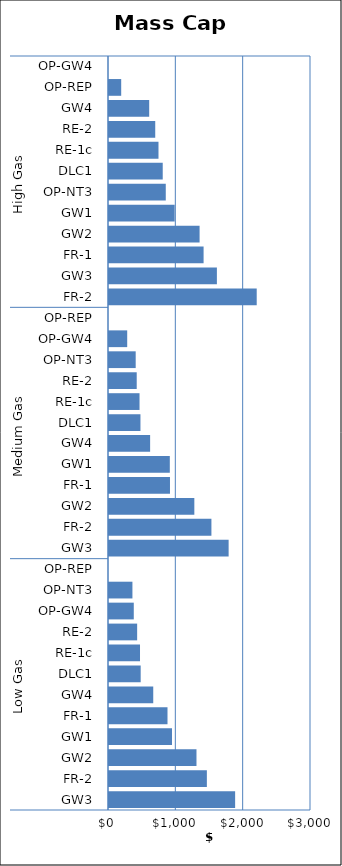
| Category | Mass Cap A |
|---|---|
| 0 | 1873.232 |
| 1 | 1453.521 |
| 2 | 1299.215 |
| 3 | 935.619 |
| 4 | 868.901 |
| 5 | 657.074 |
| 6 | 470.434 |
| 7 | 460.467 |
| 8 | 418.026 |
| 9 | 368.01 |
| 10 | 347.901 |
| 11 | 0 |
| 12 | 1776.701 |
| 13 | 1521.029 |
| 14 | 1267.308 |
| 15 | 905.645 |
| 16 | 903.176 |
| 17 | 610.823 |
| 18 | 467.153 |
| 19 | 453.375 |
| 20 | 411.703 |
| 21 | 396.344 |
| 22 | 270.372 |
| 23 | 0 |
| 24 | 2193.796 |
| 25 | 1602.348 |
| 26 | 1404.818 |
| 27 | 1345.361 |
| 28 | 975.105 |
| 29 | 843.193 |
| 30 | 798 |
| 31 | 735.015 |
| 32 | 686.674 |
| 33 | 596.911 |
| 34 | 181.178 |
| 35 | 0 |